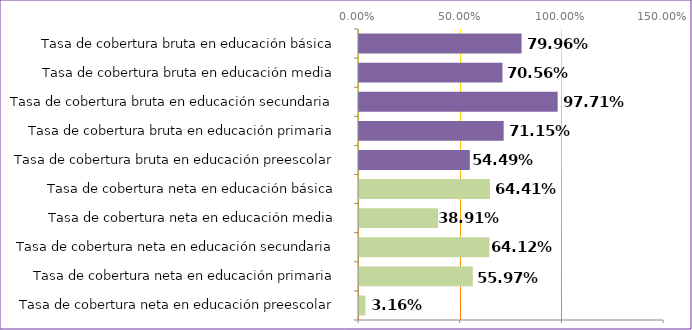
| Category | Series 0 |
|---|---|
| Tasa de cobertura neta en educación preescolar | 0.032 |
| Tasa de cobertura neta en educación primaria | 0.56 |
| Tasa de cobertura neta en educación secundaria | 0.641 |
| Tasa de cobertura neta en educación media | 0.389 |
| Tasa de cobertura neta en educación básica | 0.644 |
| Tasa de cobertura bruta en educación preescolar | 0.545 |
| Tasa de cobertura bruta en educación primaria | 0.712 |
| Tasa de cobertura bruta en educación secundaria | 0.977 |
| Tasa de cobertura bruta en educación media | 0.706 |
| Tasa de cobertura bruta en educación básica | 0.8 |